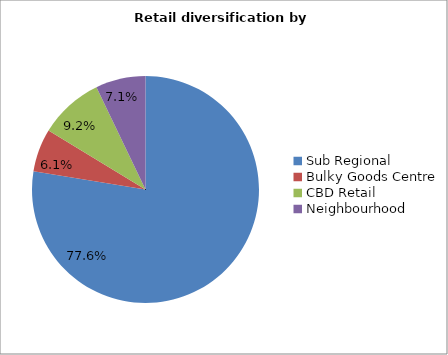
| Category | Series 0 |
|---|---|
| Sub Regional | 0.776 |
| Bulky Goods Centre | 0.061 |
| CBD Retail | 0.092 |
| Neighbourhood | 0.071 |